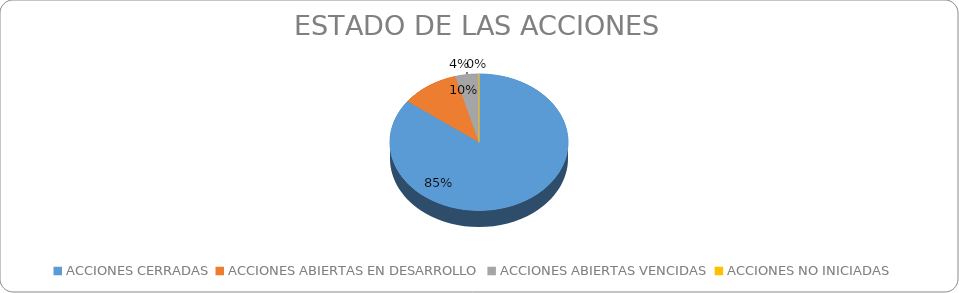
| Category | Series 0 |
|---|---|
| ACCIONES CERRADAS | 138 |
| ACCIONES ABIERTAS EN DESARROLLO | 17 |
| ACCIONES ABIERTAS VENCIDAS | 7 |
| ACCIONES NO INICIADAS | 0 |